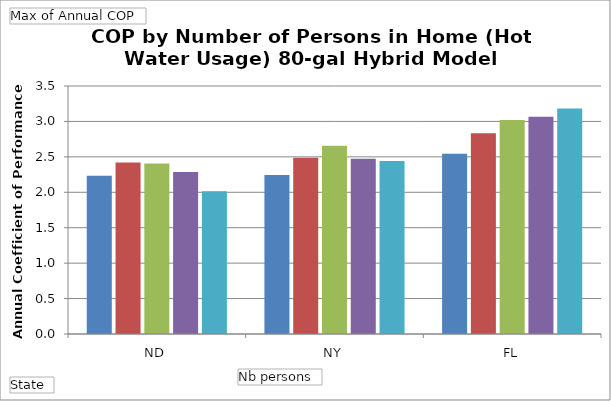
| Category | 1 | 2 | 3 | 4 | 5+ |
|---|---|---|---|---|---|
| ND | 2.234 | 2.42 | 2.407 | 2.288 | 2.014 |
| NY | 2.243 | 2.486 | 2.656 | 2.473 | 2.441 |
| FL | 2.543 | 2.833 | 3.019 | 3.067 | 3.181 |